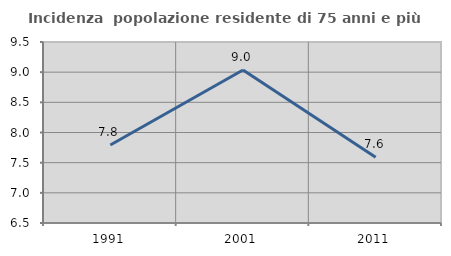
| Category | Incidenza  popolazione residente di 75 anni e più |
|---|---|
| 1991.0 | 7.793 |
| 2001.0 | 9.037 |
| 2011.0 | 7.59 |